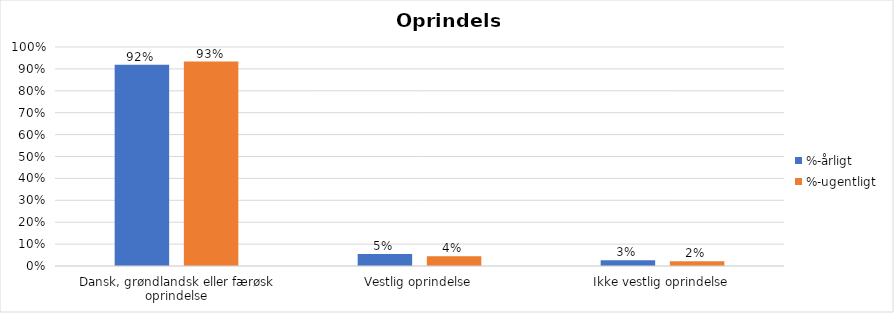
| Category | %-årligt | %-ugentligt |
|---|---|---|
| Dansk, grøndlandsk eller færøsk oprindelse | 0.919 | 0.934 |
| Vestlig oprindelse | 0.055 | 0.045 |
| Ikke vestlig oprindelse | 0.026 | 0.022 |